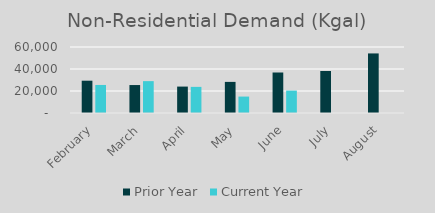
| Category | Prior Year | Current Year |
|---|---|---|
| February | 29366 | 25488 |
| March | 25412 | 28967 |
| April | 24018 | 23746 |
| May | 28279 | 14933 |
| June | 36817 | 20372 |
| July | 38205 | 0 |
| August | 54156 | 0 |